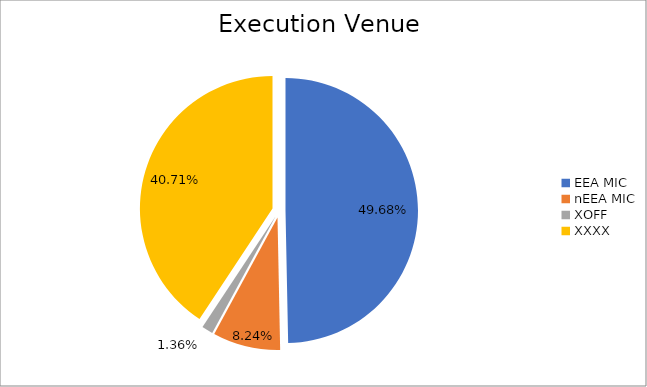
| Category | Series 0 |
|---|---|
| EEA MIC | 6464487.997 |
| nEEA MIC | 1072835.292 |
| XOFF | 177560.777 |
| XXXX | 5297553.861 |